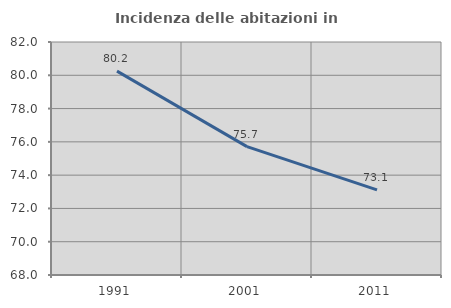
| Category | Incidenza delle abitazioni in proprietà  |
|---|---|
| 1991.0 | 80.248 |
| 2001.0 | 75.716 |
| 2011.0 | 73.112 |